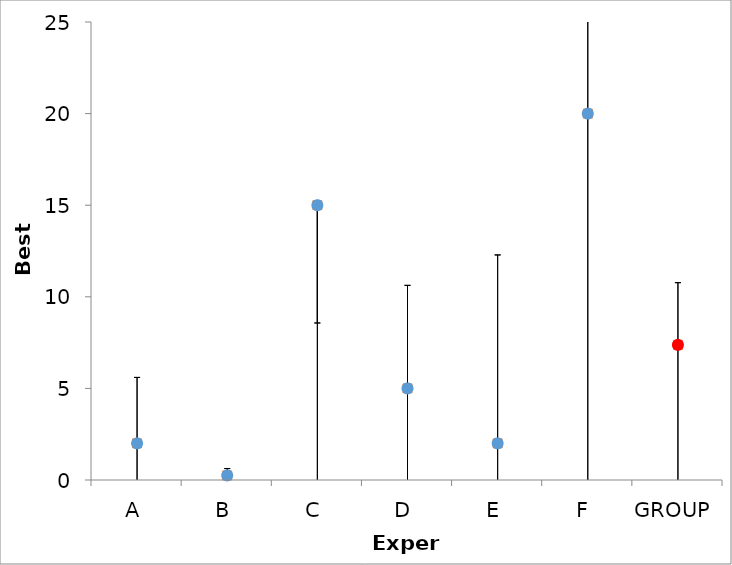
| Category | Series 1 | Series 0 |
|---|---|---|
| A | 2 | 2 |
| B | 0.25 | 0.25 |
| C | 15 | 15 |
| D | 5 | 5 |
| E | 2 | 2 |
| F | 20 | 20 |
| GROUP | 7.375 | 7.375 |